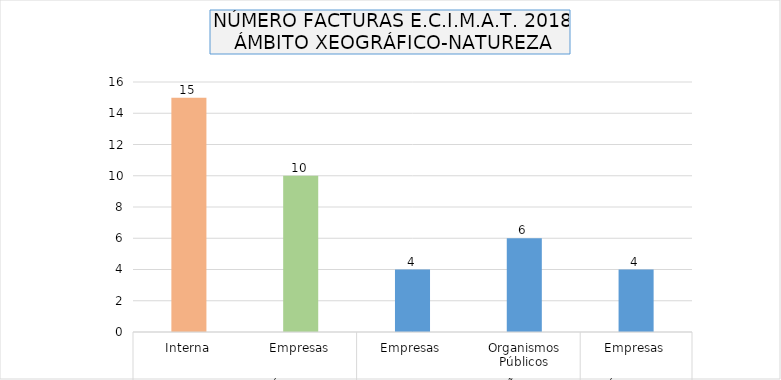
| Category | Series 0 |
|---|---|
| 0 | 15 |
| 1 | 10 |
| 2 | 4 |
| 3 | 6 |
| 4 | 4 |